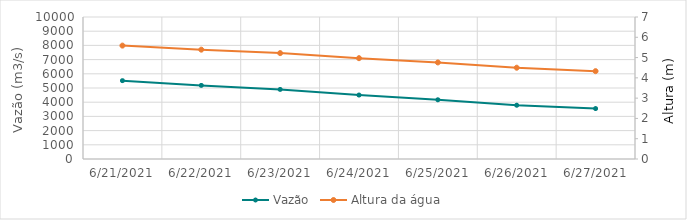
| Category | Vazão |
|---|---|
| 6/6/21 | 7487.85 |
| 6/5/21 | 7529.57 |
| 6/4/21 | 7183.33 |
| 6/3/21 | 6742.99 |
| 6/2/21 | 6459.87 |
| 6/1/21 | 6462.29 |
| 5/31/21 | 6483.05 |